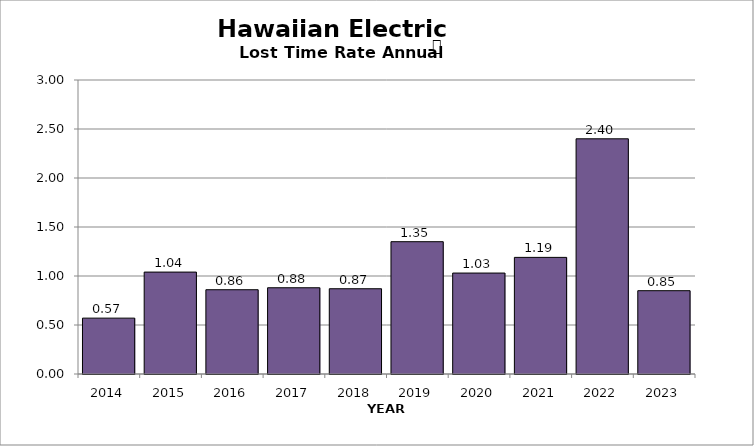
| Category | Hawaiian Electric |
|---|---|
| 2014.0 | 0.57 |
| 2015.0 | 1.04 |
| 2016.0 | 0.86 |
| 2017.0 | 0.88 |
| 2018.0 | 0.87 |
| 2019.0 | 1.35 |
| 2020.0 | 1.03 |
| 2021.0 | 1.19 |
| 2022.0 | 2.4 |
| 2023.0 | 0.85 |